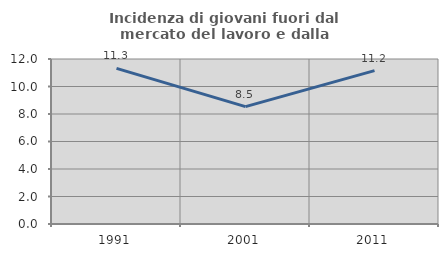
| Category | Incidenza di giovani fuori dal mercato del lavoro e dalla formazione  |
|---|---|
| 1991.0 | 11.321 |
| 2001.0 | 8.532 |
| 2011.0 | 11.157 |